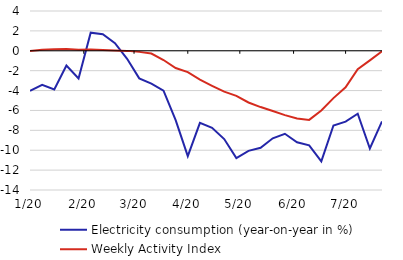
| Category | Electricity consumption (year-on-year in %) | Weekly Activity Index |
|---|---|---|
| 2020-01-06 | -4.026 | -0.03 |
| 2020-01-13 | -3.426 | 0.1 |
| 2020-01-20 | -3.896 | 0.15 |
| 2020-01-27 | -1.476 | 0.17 |
| 2020-02-03 | -2.776 | 0.11 |
| 2020-02-10 | 1.824 | 0.14 |
| 2020-02-17 | 1.667 | 0.08 |
| 2020-02-24 | 0.768 | 0.04 |
| 2020-03-02 | -0.807 | -0.01 |
| 2020-03-09 | -2.776 | -0.11 |
| 2020-03-16 | -3.298 | -0.28 |
| 2020-03-23 | -4.019 | -0.93 |
| 2020-03-30 | -6.98 | -1.73 |
| 2020-04-06 | -10.596 | -2.15 |
| 2020-04-13 | -7.243 | -2.9 |
| 2020-04-20 | -7.74 | -3.52 |
| 2020-04-27 | -8.876 | -4.11 |
| 2020-05-04 | -10.786 | -4.53 |
| 2020-05-11 | -10.065 | -5.2 |
| 2020-05-18 | -9.755 | -5.66 |
| 2020-05-25 | -8.804 | -6.06 |
| 2020-06-01 | -8.349 | -6.47 |
| 2020-06-08 | -9.194 | -6.81 |
| 2020-06-15 | -9.504 | -6.95 |
| 2020-06-22 | -11.116 | -6 |
| 2020-06-29 | -7.514 | -4.76 |
| 2020-07-06 | -7.122 | -3.68 |
| 2020-07-13 | -6.335 | -1.85 |
| 2020-07-20 | -9.824 | -0.97 |
| 2020-07-27 | -7.1 | -0.06 |